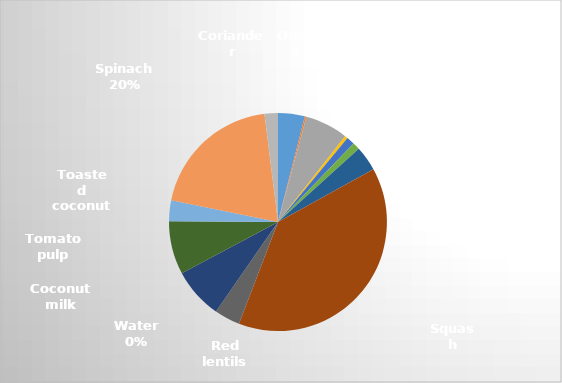
| Category | Total cost |
|---|---|
| Onions | 0.896 |
| Ginger | 0.052 |
| Lemograss | 1.438 |
| Garlic | 0.1 |
| Curry powder | 0.267 |
| Ground coriander | 0.245 |
| Potatoes | 0.833 |
| Squash | 8.775 |
| Red lentils | 0.86 |
| Water | 0 |
| Coconut milk | 1.707 |
| Tomato pulp | 1.789 |
| Toasted coconut | 0.695 |
| Spinach | 4.475 |
| Coriander | 0.448 |